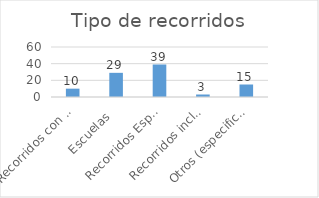
| Category | Series 0 |
|---|---|
| Recorridos con taller  | 10 |
| Escuelas  | 29 |
| Recorridos Especiales (VIP) | 39 |
| Recorridos incluyentes  | 3 |
| Otros (especificar) | 15 |